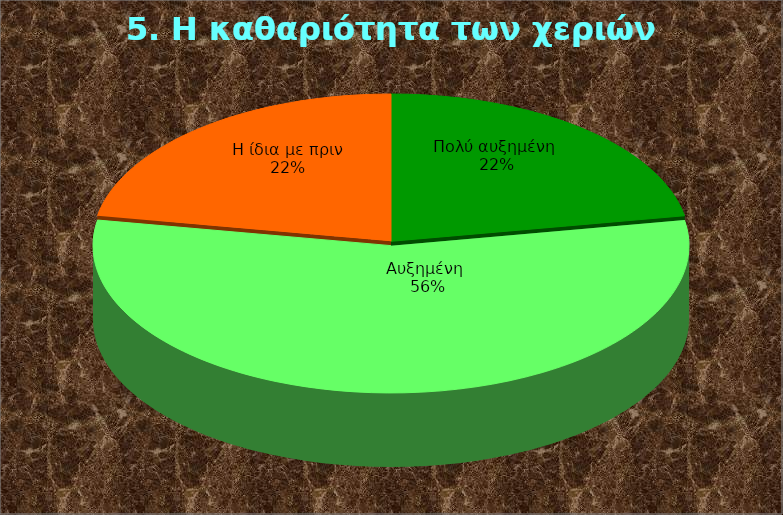
| Category | Series 0 |
|---|---|
| Πολύ αυξημένη  | 10 |
| Αυξημένη  | 25 |
| Η ίδια με πριν | 10 |